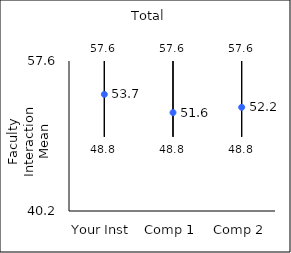
| Category | 25th percentile | 75th percentile | Mean |
|---|---|---|---|
| Your Inst | 48.8 | 57.6 | 53.73 |
| Comp 1 | 48.8 | 57.6 | 51.62 |
| Comp 2 | 48.8 | 57.6 | 52.23 |